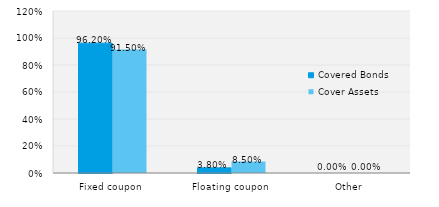
| Category | Covered Bonds | Cover Assets |
|---|---|---|
| Fixed coupon | 0.962 | 0.915 |
| Floating coupon | 0.038 | 0.085 |
| Other | 0 | 0 |